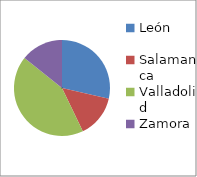
| Category | Series 0 |
|---|---|
| León | 2 |
| Salamanca | 1 |
| Valladolid | 3 |
| Zamora | 1 |